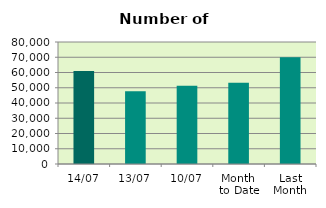
| Category | Series 0 |
|---|---|
| 14/07 | 60936 |
| 13/07 | 47784 |
| 10/07 | 51258 |
| Month 
to Date | 53279 |
| Last
Month | 70062.455 |